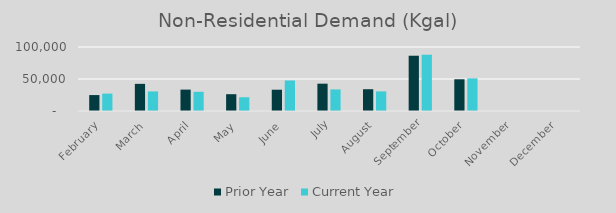
| Category | Prior Year | Current Year |
|---|---|---|
| February | 24891.705 | 27184.287 |
| March | 42416.796 | 30591.784 |
| April | 33427.881 | 30008.586 |
| May | 26254.448 | 21459.484 |
| June | 33248.873 | 47687.401 |
| July | 42679.938 | 33702.696 |
| August | 34036.498 | 30630.765 |
| September | 86367.775 | 87939.966 |
| October | 49561.754 | 51017.647 |
| November | 0 | 0 |
| December | 0 | 0 |